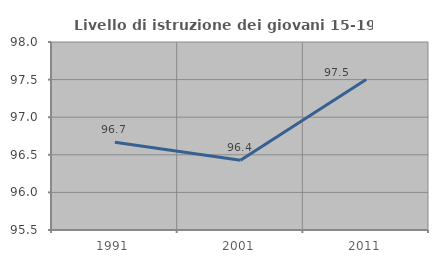
| Category | Livello di istruzione dei giovani 15-19 anni |
|---|---|
| 1991.0 | 96.667 |
| 2001.0 | 96.429 |
| 2011.0 | 97.5 |